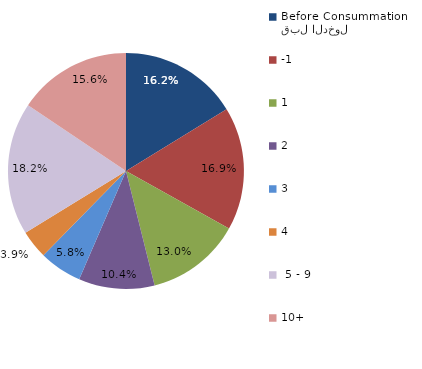
| Category | Series 0 |
|---|---|
| قبل الدخول
Before Consummation | 16.234 |
| -1 | 16.883 |
| 1 | 12.987 |
| 2 | 10.39 |
| 3 | 5.844 |
| 4 | 3.896 |
|  5 - 9 | 18.182 |
| 10+ | 15.584 |